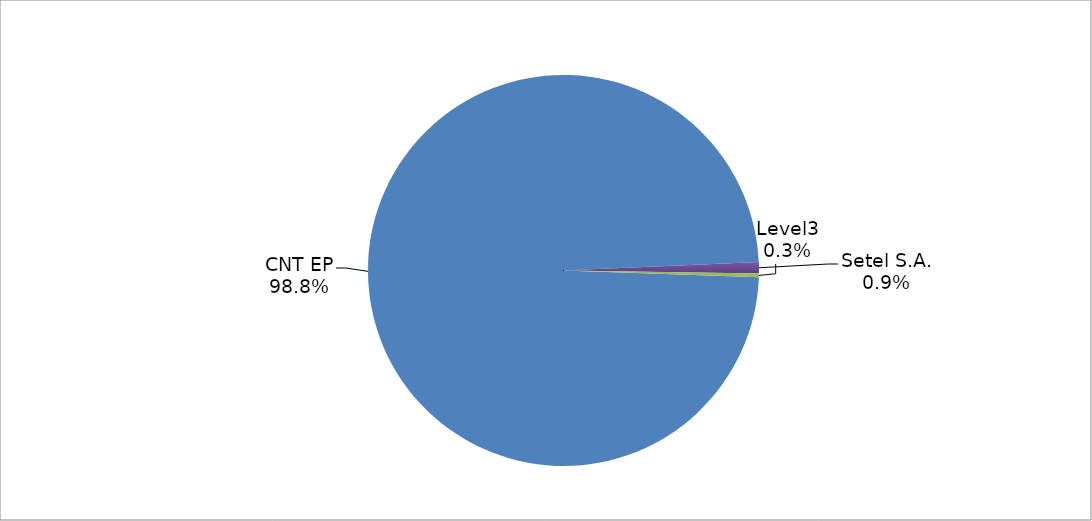
| Category | Series 0 |
|---|---|
| CNT EP | 317 |
| Setel S.A. | 3 |
| Level3 | 1 |